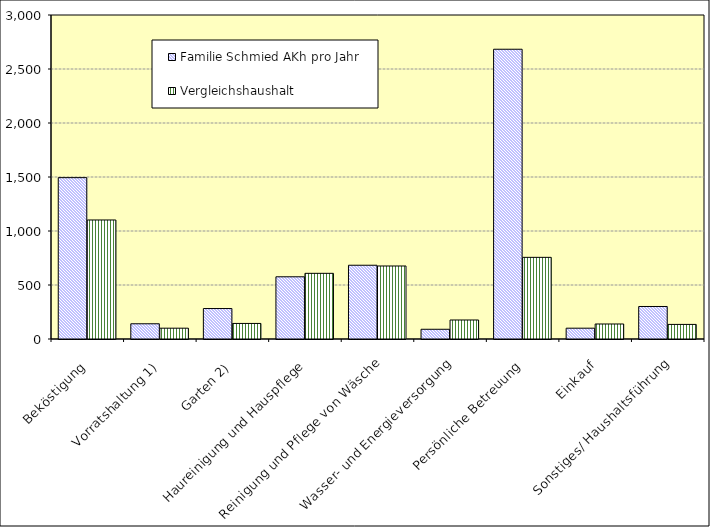
| Category | Familie Schmied AKh pro Jahr | Vergleichshaushalt |
|---|---|---|
| Beköstigung | 1494 | 1102 |
| Vorratshaltung 1) | 141 | 100 |
| Garten 2) | 282 | 144 |
| Haureinigung und Hauspflege | 576 | 608 |
| Reinigung und Pflege von Wäsche | 683 | 676 |
| Wasser- und Energieversorgung | 90 | 176 |
| Persönliche Betreuung | 2683 | 756 |
| Einkauf | 100 | 139 |
| Sonstiges/ Haushaltsführung | 301 | 135 |